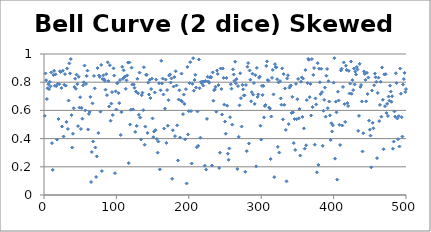
| Category | Bell Curve (2 dice) Skewed High |
|---|---|
| 0 | 0.562 |
| 1 | 0.862 |
| 2 | 0.814 |
| 3 | 0.68 |
| 4 | 0.757 |
| 5 | 0.786 |
| 6 | 0.751 |
| 7 | 0.803 |
| 8 | 0.771 |
| 9 | 0.869 |
| 10 | 0.368 |
| 11 | 0.178 |
| 12 | 0.852 |
| 13 | 0.881 |
| 14 | 0.775 |
| 15 | 0.856 |
| 16 | 0.772 |
| 17 | 0.393 |
| 18 | 0.789 |
| 19 | 0.539 |
| 20 | 0.786 |
| 21 | 0.877 |
| 22 | 0.872 |
| 23 | 0.758 |
| 24 | 0.486 |
| 25 | 0.881 |
| 26 | 0.415 |
| 27 | 0.781 |
| 28 | 0.857 |
| 29 | 0.776 |
| 30 | 0.518 |
| 31 | 0.898 |
| 32 | 0.468 |
| 33 | 0.67 |
| 34 | 0.933 |
| 35 | 0.863 |
| 36 | 0.965 |
| 37 | 0.567 |
| 38 | 0.337 |
| 39 | 0.434 |
| 40 | 0.615 |
| 41 | 0.766 |
| 42 | 0.825 |
| 43 | 0.753 |
| 44 | 0.854 |
| 45 | 0.787 |
| 46 | 0.489 |
| 47 | 0.838 |
| 48 | 0.62 |
| 49 | 0.694 |
| 50 | 0.468 |
| 51 | 0.617 |
| 52 | 0.541 |
| 53 | 0.778 |
| 54 | 0.799 |
| 55 | 0.918 |
| 56 | 0.6 |
| 57 | 0.787 |
| 58 | 0.844 |
| 59 | 0.882 |
| 60 | 0.465 |
| 61 | 0.575 |
| 62 | 0.59 |
| 63 | 0.696 |
| 64 | 0.092 |
| 65 | 0.305 |
| 66 | 0.65 |
| 67 | 0.379 |
| 68 | 0.844 |
| 69 | 0.756 |
| 70 | 0.337 |
| 71 | 0.128 |
| 72 | 0.274 |
| 73 | 0.9 |
| 74 | 0.439 |
| 75 | 0.848 |
| 76 | 0.838 |
| 77 | 0.591 |
| 78 | 0.922 |
| 79 | 0.17 |
| 80 | 0.823 |
| 81 | 0.849 |
| 82 | 0.82 |
| 83 | 0.81 |
| 84 | 0.747 |
| 85 | 0.857 |
| 86 | 0.708 |
| 87 | 0.941 |
| 88 | 0.808 |
| 89 | 0.628 |
| 90 | 0.921 |
| 91 | 0.527 |
| 92 | 0.648 |
| 93 | 0.729 |
| 94 | 0.567 |
| 95 | 0.898 |
| 96 | 0.847 |
| 97 | 0.155 |
| 98 | 0.735 |
| 99 | 0.606 |
| 100 | 0.792 |
| 101 | 0.796 |
| 102 | 0.722 |
| 103 | 0.652 |
| 104 | 0.815 |
| 105 | 0.426 |
| 106 | 0.587 |
| 107 | 0.909 |
| 108 | 0.824 |
| 109 | 0.884 |
| 110 | 0.835 |
| 111 | 0.841 |
| 112 | 0.753 |
| 113 | 0.813 |
| 114 | 0.848 |
| 115 | 0.939 |
| 116 | 0.227 |
| 117 | 0.94 |
| 118 | 0.5 |
| 119 | 0.605 |
| 120 | 0.903 |
| 121 | 0.784 |
| 122 | 0.608 |
| 123 | 0.783 |
| 124 | 0.76 |
| 125 | 0.447 |
| 126 | 0.734 |
| 127 | 0.49 |
| 128 | 0.824 |
| 129 | 0.721 |
| 130 | 0.569 |
| 131 | 0.868 |
| 132 | 0.549 |
| 133 | 0.394 |
| 134 | 0.707 |
| 135 | 0.726 |
| 136 | 0.602 |
| 137 | 0.906 |
| 138 | 0.357 |
| 139 | 0.485 |
| 140 | 0.852 |
| 141 | 0.852 |
| 142 | 0.44 |
| 143 | 0.797 |
| 144 | 0.713 |
| 145 | 0.817 |
| 146 | 0.687 |
| 147 | 0.751 |
| 148 | 0.825 |
| 149 | 0.543 |
| 150 | 0.41 |
| 151 | 0.45 |
| 152 | 0.728 |
| 153 | 0.46 |
| 154 | 0.819 |
| 155 | 0.397 |
| 156 | 0.3 |
| 157 | 0.379 |
| 158 | 0.792 |
| 159 | 0.182 |
| 160 | 0.743 |
| 161 | 0.952 |
| 162 | 0.791 |
| 163 | 0.826 |
| 164 | 0.713 |
| 165 | 0.471 |
| 166 | 0.613 |
| 167 | 0.819 |
| 168 | 0.369 |
| 169 | 0.744 |
| 170 | 0.491 |
| 171 | 0.672 |
| 172 | 0.847 |
| 173 | 0.856 |
| 174 | 0.798 |
| 175 | 0.827 |
| 176 | 0.115 |
| 177 | 0.459 |
| 178 | 0.769 |
| 179 | 0.837 |
| 180 | 0.417 |
| 181 | 0.878 |
| 182 | 0.777 |
| 183 | 0.494 |
| 184 | 0.245 |
| 185 | 0.677 |
| 186 | 0.743 |
| 187 | 0.407 |
| 188 | 0.67 |
| 189 | 0.861 |
| 190 | 0.662 |
| 191 | 0.573 |
| 192 | 0.712 |
| 193 | 0.646 |
| 194 | 0.395 |
| 195 | 0.751 |
| 196 | 0.082 |
| 197 | 0.908 |
| 198 | 0.43 |
| 199 | 0.595 |
| 200 | 0.793 |
| 201 | 0.943 |
| 202 | 0.594 |
| 203 | 0.223 |
| 204 | 0.788 |
| 205 | 0.97 |
| 206 | 0.74 |
| 207 | 0.816 |
| 208 | 0.853 |
| 209 | 0.762 |
| 210 | 0.338 |
| 211 | 0.592 |
| 212 | 0.349 |
| 213 | 0.961 |
| 214 | 0.757 |
| 215 | 0.406 |
| 216 | 0.802 |
| 217 | 0.793 |
| 218 | 0.804 |
| 219 | 0.776 |
| 220 | 0.805 |
| 221 | 0.208 |
| 222 | 0.81 |
| 223 | 0.18 |
| 224 | 0.54 |
| 225 | 0.838 |
| 226 | 0.806 |
| 227 | 0.796 |
| 228 | 0.834 |
| 229 | 0.838 |
| 230 | 0.835 |
| 231 | 0.209 |
| 232 | 0.87 |
| 233 | 0.669 |
| 234 | 0.742 |
| 235 | 0.75 |
| 236 | 0.768 |
| 237 | 0.591 |
| 238 | 0.883 |
| 239 | 0.859 |
| 240 | 0.78 |
| 241 | 0.192 |
| 242 | 0.3 |
| 243 | 0.898 |
| 244 | 0.752 |
| 245 | 0.571 |
| 246 | 0.897 |
| 247 | 0.83 |
| 248 | 0.641 |
| 249 | 0.521 |
| 250 | 0.435 |
| 251 | 0.83 |
| 252 | 0.633 |
| 253 | 0.293 |
| 254 | 0.25 |
| 255 | 0.33 |
| 256 | 0.552 |
| 257 | 0.786 |
| 258 | 0.754 |
| 259 | 0.499 |
| 260 | 0.891 |
| 261 | 0.855 |
| 262 | 0.81 |
| 263 | 0.945 |
| 264 | 0.792 |
| 265 | 0.822 |
| 266 | 0.185 |
| 267 | 0.773 |
| 268 | 0.412 |
| 269 | 0.636 |
| 270 | 0.863 |
| 271 | 0.687 |
| 272 | 0.485 |
| 273 | 0.781 |
| 274 | 0.749 |
| 275 | 0.706 |
| 276 | 0.707 |
| 277 | 0.165 |
| 278 | 0.78 |
| 279 | 0.311 |
| 280 | 0.909 |
| 281 | 0.936 |
| 282 | 0.365 |
| 283 | 0.883 |
| 284 | 0.817 |
| 285 | 0.665 |
| 286 | 0.729 |
| 287 | 0.86 |
| 288 | 0.712 |
| 289 | 0.794 |
| 290 | 0.646 |
| 291 | 0.85 |
| 292 | 0.203 |
| 293 | 0.902 |
| 294 | 0.696 |
| 295 | 0.713 |
| 296 | 0.832 |
| 297 | 0.839 |
| 298 | 0.491 |
| 299 | 0.393 |
| 300 | 0.774 |
| 301 | 0.71 |
| 302 | 0.774 |
| 303 | 0.551 |
| 304 | 0.631 |
| 305 | 0.639 |
| 306 | 0.915 |
| 307 | 0.948 |
| 308 | 0.815 |
| 309 | 0.812 |
| 310 | 0.62 |
| 311 | 0.612 |
| 312 | 0.255 |
| 313 | 0.557 |
| 314 | 0.831 |
| 315 | 0.887 |
| 316 | 0.713 |
| 317 | 0.127 |
| 318 | 0.928 |
| 319 | 0.907 |
| 320 | 0.905 |
| 321 | 0.821 |
| 322 | 0.341 |
| 323 | 0.798 |
| 324 | 0.301 |
| 325 | 0.808 |
| 326 | 0.685 |
| 327 | 0.64 |
| 328 | 0.898 |
| 329 | 0.536 |
| 330 | 0.857 |
| 331 | 0.639 |
| 332 | 0.755 |
| 333 | 0.462 |
| 334 | 0.097 |
| 335 | 0.827 |
| 336 | 0.849 |
| 337 | 0.503 |
| 338 | 0.761 |
| 339 | 0.773 |
| 340 | 0.777 |
| 341 | 0.582 |
| 342 | 0.696 |
| 343 | 0.586 |
| 344 | 0.368 |
| 345 | 0.539 |
| 346 | 0.32 |
| 347 | 0.788 |
| 348 | 0.537 |
| 349 | 0.679 |
| 350 | 0.823 |
| 351 | 0.544 |
| 352 | 0.61 |
| 353 | 0.28 |
| 354 | 0.803 |
| 355 | 0.834 |
| 356 | 0.554 |
| 357 | 0.826 |
| 358 | 0.473 |
| 359 | 0.329 |
| 360 | 0.886 |
| 361 | 0.352 |
| 362 | 0.673 |
| 363 | 0.794 |
| 364 | 0.965 |
| 365 | 0.959 |
| 366 | 0.694 |
| 367 | 0.787 |
| 368 | 0.564 |
| 369 | 0.964 |
| 370 | 0.624 |
| 371 | 0.852 |
| 372 | 0.901 |
| 373 | 0.357 |
| 374 | 0.685 |
| 375 | 0.642 |
| 376 | 0.161 |
| 377 | 0.935 |
| 378 | 0.214 |
| 379 | 0.896 |
| 380 | 0.8 |
| 381 | 0.716 |
| 382 | 0.895 |
| 383 | 0.73 |
| 384 | 0.349 |
| 385 | 0.597 |
| 386 | 0.675 |
| 387 | 0.761 |
| 388 | 0.556 |
| 389 | 0.846 |
| 390 | 0.894 |
| 391 | 0.616 |
| 392 | 0.807 |
| 393 | 0.663 |
| 394 | 0.565 |
| 395 | 0.39 |
| 396 | 0.509 |
| 397 | 0.45 |
| 398 | 0.495 |
| 399 | 0.797 |
| 400 | 0.971 |
| 401 | 0.258 |
| 402 | 0.662 |
| 403 | 0.586 |
| 404 | 0.109 |
| 405 | 0.733 |
| 406 | 0.67 |
| 407 | 0.498 |
| 408 | 0.355 |
| 409 | 0.883 |
| 410 | 0.896 |
| 411 | 0.493 |
| 412 | 0.766 |
| 413 | 0.94 |
| 414 | 0.645 |
| 415 | 0.518 |
| 416 | 0.917 |
| 417 | 0.887 |
| 418 | 0.652 |
| 419 | 0.631 |
| 420 | 0.881 |
| 421 | 0.72 |
| 422 | 0.79 |
| 423 | 0.946 |
| 424 | 0.718 |
| 425 | 0.815 |
| 426 | 0.744 |
| 427 | 0.897 |
| 428 | 0.784 |
| 429 | 0.876 |
| 430 | 0.854 |
| 431 | 0.908 |
| 432 | 0.89 |
| 433 | 0.455 |
| 434 | 0.561 |
| 435 | 0.93 |
| 436 | 0.767 |
| 437 | 0.78 |
| 438 | 0.664 |
| 439 | 0.309 |
| 440 | 0.438 |
| 441 | 0.876 |
| 442 | 0.859 |
| 443 | 0.816 |
| 444 | 0.664 |
| 445 | 0.867 |
| 446 | 0.716 |
| 447 | 0.833 |
| 448 | 0.527 |
| 449 | 0.463 |
| 450 | 0.421 |
| 451 | 0.197 |
| 452 | 0.741 |
| 453 | 0.512 |
| 454 | 0.473 |
| 455 | 0.778 |
| 456 | 0.861 |
| 457 | 0.835 |
| 458 | 0.802 |
| 459 | 0.261 |
| 460 | 0.724 |
| 461 | 0.832 |
| 462 | 0.524 |
| 463 | 0.639 |
| 464 | 0.803 |
| 465 | 0.555 |
| 466 | 0.905 |
| 467 | 0.675 |
| 468 | 0.325 |
| 469 | 0.856 |
| 470 | 0.63 |
| 471 | 0.857 |
| 472 | 0.582 |
| 473 | 0.647 |
| 474 | 0.561 |
| 475 | 0.698 |
| 476 | 0.669 |
| 477 | 0.775 |
| 478 | 0.733 |
| 479 | 0.661 |
| 480 | 0.7 |
| 481 | 0.328 |
| 482 | 0.379 |
| 483 | 0.593 |
| 484 | 0.556 |
| 485 | 0.863 |
| 486 | 0.794 |
| 487 | 0.543 |
| 488 | 0.396 |
| 489 | 0.56 |
| 490 | 0.344 |
| 491 | 0.897 |
| 492 | 0.718 |
| 493 | 0.551 |
| 494 | 0.414 |
| 495 | 0.783 |
| 496 | 0.822 |
| 497 | 0.866 |
| 498 | 0.731 |
| 499 | 0.751 |